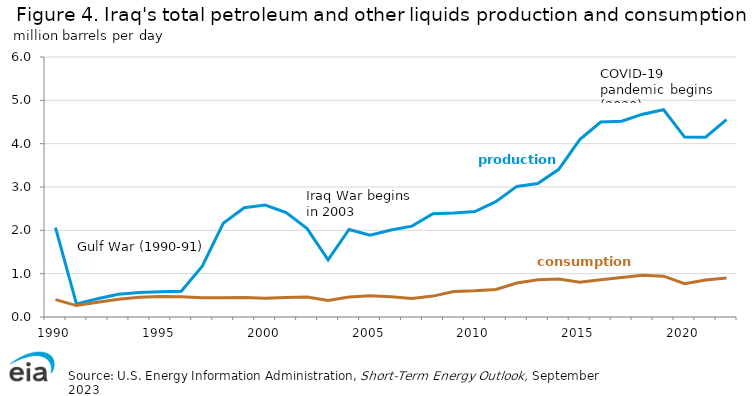
| Category | production | consumption |
|---|---|---|
| 1990.0 | 2064 | 400 |
| 1991.0 | 302 | 263.3 |
| 1992.0 | 421 | 340.8 |
| 1993.0 | 522.599 | 408 |
| 1994.0 | 567.263 | 457.1 |
| 1995.0 | 579.904 | 474 |
| 1996.0 | 593.407 | 469 |
| 1997.0 | 1172.343 | 443.2 |
| 1998.0 | 2162.135 | 447 |
| 1999.0 | 2520.205 | 451 |
| 2000.0 | 2581.969 | 432.932 |
| 2001.0 | 2408.822 | 448.936 |
| 2002.0 | 2039.791 | 463.527 |
| 2003.0 | 1318.044 | 381.592 |
| 2004.0 | 2020.567 | 461.2 |
| 2005.0 | 1889.42 | 489.079 |
| 2006.0 | 2009.441 | 464.935 |
| 2007.0 | 2096.635 | 429.067 |
| 2008.0 | 2384.552 | 482.34 |
| 2009.0 | 2399.167 | 585.915 |
| 2010.0 | 2434.746 | 603.217 |
| 2011.0 | 2661.644 | 635.739 |
| 2012.0 | 3014.009 | 785 |
| 2013.0 | 3081.924 | 861 |
| 2014.0 | 3408.006 | 879 |
| 2015.0 | 4093.104 | 803 |
| 2016.0 | 4500.191 | 860 |
| 2017.0 | 4518.89 | 910.643 |
| 2018.0 | 4680.761 | 960.842 |
| 2019.0 | 4783.265 | 941.607 |
| 2020.0 | 4151.776 | 770.201 |
| 2021.0 | 4149.022 | 852.562 |
| 2022.0 | 4553.357 | 899.326 |